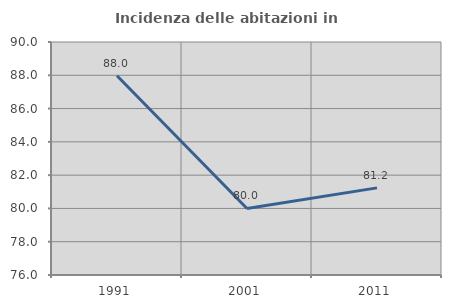
| Category | Incidenza delle abitazioni in proprietà  |
|---|---|
| 1991.0 | 87.97 |
| 2001.0 | 80 |
| 2011.0 | 81.235 |